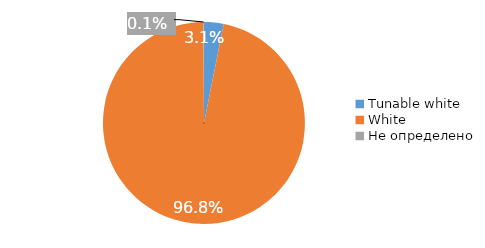
| Category | Series 0 |
|---|---|
| Tunable white | 0.031 |
| White | 0.968 |
| Не определено | 0.001 |